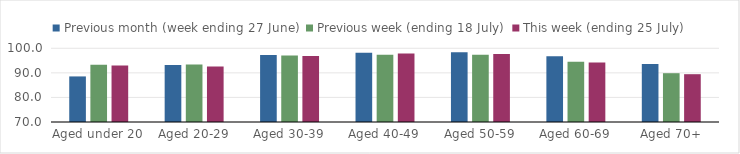
| Category | Previous month (week ending 27 June) | Previous week (ending 18 July) | This week (ending 25 July) |
|---|---|---|---|
| Aged under 20 | 88.548 | 93.263 | 93.032 |
| Aged 20-29 | 93.216 | 93.385 | 92.615 |
| Aged 30-39 | 97.274 | 97.063 | 96.882 |
| Aged 40-49 | 98.2 | 97.401 | 97.846 |
| Aged 50-59 | 98.375 | 97.406 | 97.674 |
| Aged 60-69 | 96.804 | 94.506 | 94.18 |
| Aged 70+ | 93.646 | 89.864 | 89.458 |